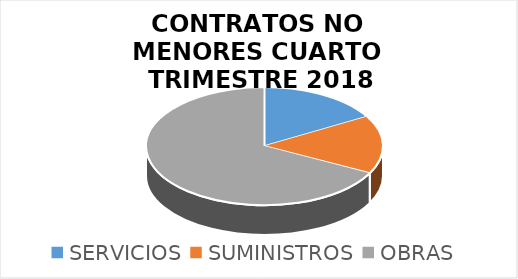
| Category | Series 0 |
|---|---|
| SERVICIOS | 426223.14 |
| SUMINISTROS | 407372.5 |
| OBRAS | 1722312.1 |